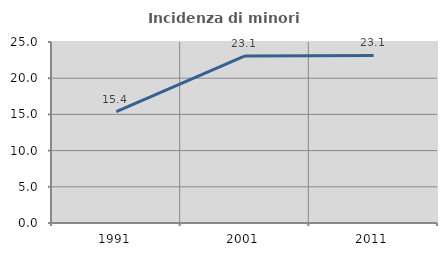
| Category | Incidenza di minori stranieri |
|---|---|
| 1991.0 | 15.385 |
| 2001.0 | 23.077 |
| 2011.0 | 23.137 |